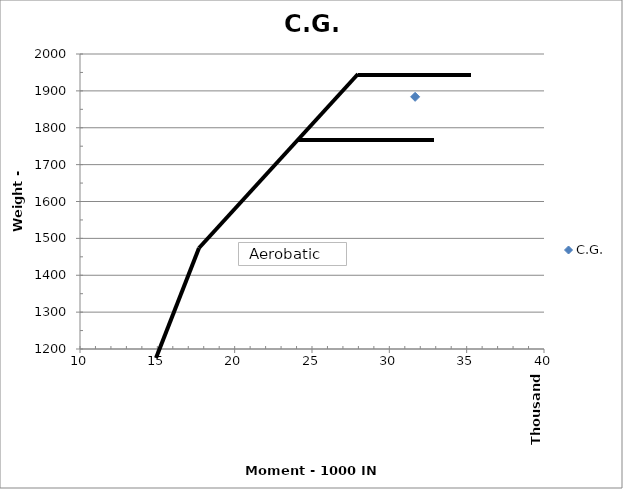
| Category | C.G. |
|---|---|
| 31667.625900000003 | 1883.84 |